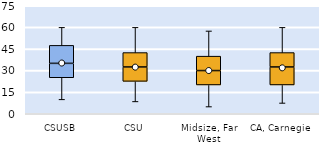
| Category | 25th | 50th | 75th |
|---|---|---|---|
| CSUSB | 25 | 10 | 12.5 |
| CSU | 22.5 | 10 | 10 |
| Midsize, Far West | 20 | 10 | 10 |
| CA, Carnegie | 20 | 12.5 | 10 |